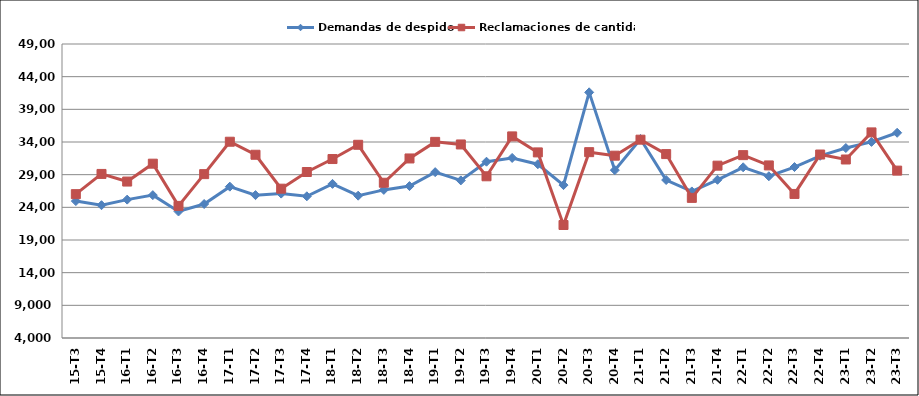
| Category | Demandas de despido | Reclamaciones de cantidad |
|---|---|---|
| 15-T3 | 24957 | 26018 |
| 15-T4 | 24328 | 29112 |
| 16-T1 | 25182 | 27945 |
| 16-T2 | 25866 | 30682 |
| 16-T3 | 23364 | 24220 |
| 16-T4 | 24509 | 29081 |
| 17-T1 | 27166 | 34041 |
| 17-T2 | 25869 | 32047 |
| 17-T3 | 26101 | 26854 |
| 17-T4 | 25688 | 29408 |
| 18-T1 | 27589 | 31392 |
| 18-T2 | 25785 | 33573 |
| 18-T3 | 26669 | 27761 |
| 18-T4 | 27251 | 31480 |
| 19-T1 | 29386 | 34020 |
| 19-T2 | 28121 | 33623 |
| 19-T3 | 30981 | 28752 |
| 19-T4 | 31561 | 34857 |
| 20-T1 | 30597 | 32408 |
| 20-T2 | 27401 | 21297 |
| 20-T3 | 41597 | 32446 |
| 20-T4 | 29692 | 31906 |
| 21-T1 | 34461 | 34356 |
| 21-T2 | 28179 | 32151 |
| 21-T3 | 26434 | 25447 |
| 21-T4 | 28219 | 30377 |
| 22-T1 | 30126 | 31990 |
| 22-T2 | 28753 | 30414 |
| 22-T3 | 30167 | 26050 |
| 22-T4 | 31889 | 32084 |
| 23-T1 | 33079 | 31323 |
| 23-T2 | 34014 | 35469 |
| 23-T3 | 35413 | 29621 |